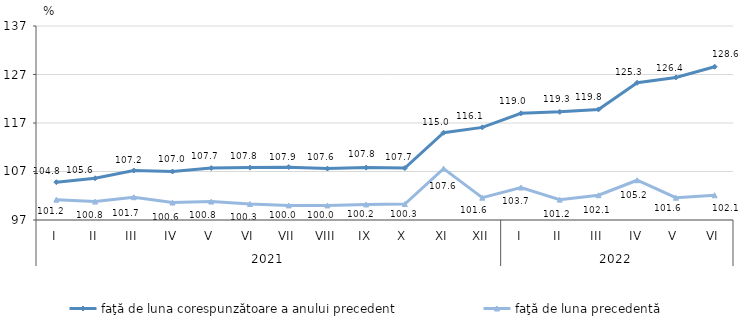
| Category | faţă de luna corespunzătoare a anului precedent | faţă de luna precedentă   |
|---|---|---|
| 0 | 104.8 | 101.2 |
| 1 | 105.6 | 100.8 |
| 2 | 107.2 | 101.7 |
| 3 | 107 | 100.6 |
| 4 | 107.7 | 100.8 |
| 5 | 107.8 | 100.3 |
| 6 | 107.9 | 100 |
| 7 | 107.6 | 100 |
| 8 | 107.8 | 100.2 |
| 9 | 107.7 | 100.3 |
| 10 | 115 | 107.6 |
| 11 | 116.1 | 101.6 |
| 12 | 119 | 103.7 |
| 13 | 119.3 | 101.2 |
| 14 | 119.8 | 102.1 |
| 15 | 125.3 | 105.2 |
| 16 | 126.4 | 101.6 |
| 17 | 128.6 | 102.1 |